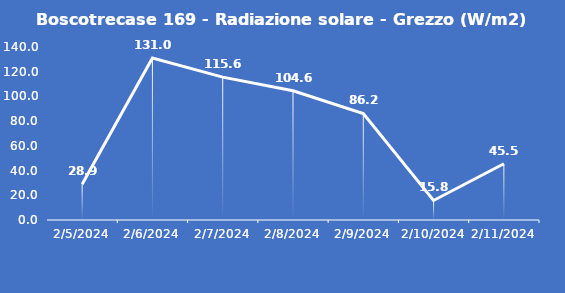
| Category | Boscotrecase 169 - Radiazione solare - Grezzo (W/m2) |
|---|---|
| 2/5/24 | 28.9 |
| 2/6/24 | 131 |
| 2/7/24 | 115.6 |
| 2/8/24 | 104.6 |
| 2/9/24 | 86.2 |
| 2/10/24 | 15.8 |
| 2/11/24 | 45.5 |